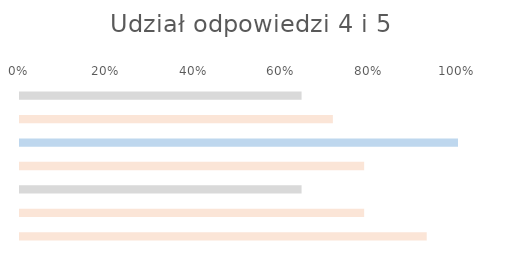
| Category | Series 0 |
|---|---|
| 0 | 0.643 |
| 1 | 0.714 |
| 2 | 1 |
| 3 | 0.786 |
| 4 | 0.643 |
| 5 | 0.786 |
| 6 | 0.929 |